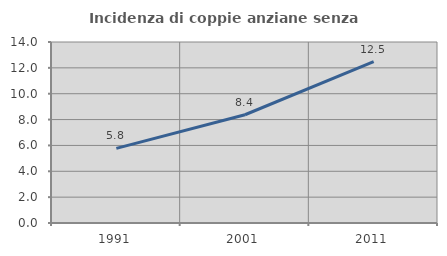
| Category | Incidenza di coppie anziane senza figli  |
|---|---|
| 1991.0 | 5.774 |
| 2001.0 | 8.372 |
| 2011.0 | 12.48 |